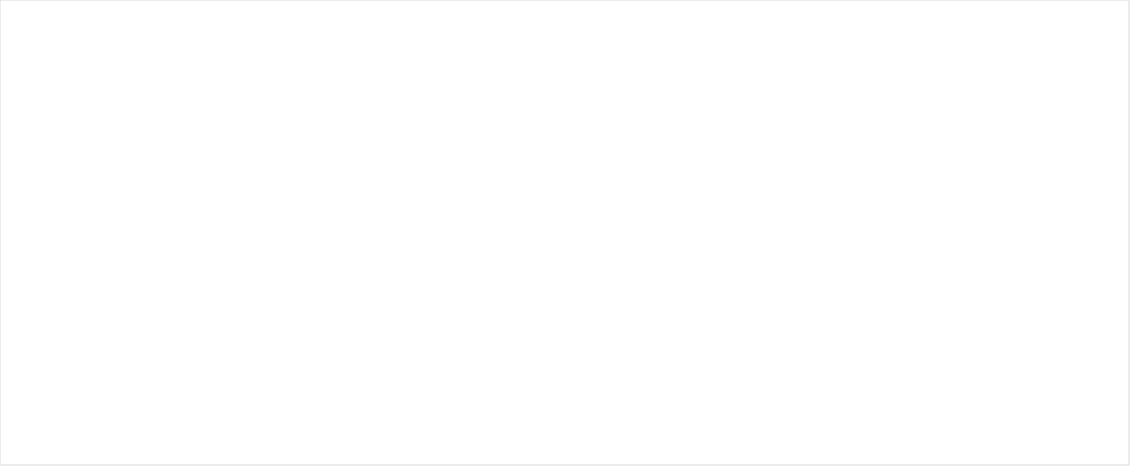
| Category | Scenario 1 | Scenario 2 | Scenario 3 | Scenario 4 |
|---|---|---|---|---|
| ref | 0 | 0 | 0 | 0 |
|  | 0 | 0 | 0 | 0 |
|  | 0 | 0 | 0 | 0 |
|  | 0 | 0 | 0 | 0 |
|  | 0 | 0 | 0 | 0 |
|  | 0 | 0 | 0 | 0 |
| 2030 | 0 | 0 | 0 | 0 |
|  | 0 | 0 | 0 | 0 |
|  | 0 | 0 | 0 | 0 |
|  | 0 | 0 | 0 | 0 |
|  | 0 | 0 | 0 | 0 |
|  | 0 | 0 | 0 | 0 |
|  | 0 | 0 | 0 | 0 |
|  | 0 | 0 | 0 | 0 |
|  | 0 | 0 | 0 | 0 |
|  | 0 | 0 | 0 | 0 |
| 2050 | 0 | 0 | 0 | 0 |